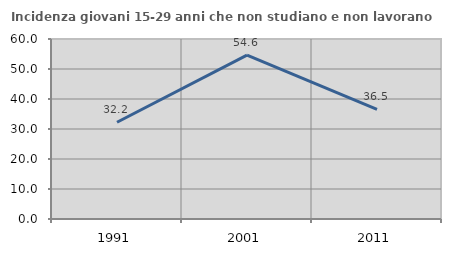
| Category | Incidenza giovani 15-29 anni che non studiano e non lavorano  |
|---|---|
| 1991.0 | 32.239 |
| 2001.0 | 54.646 |
| 2011.0 | 36.514 |